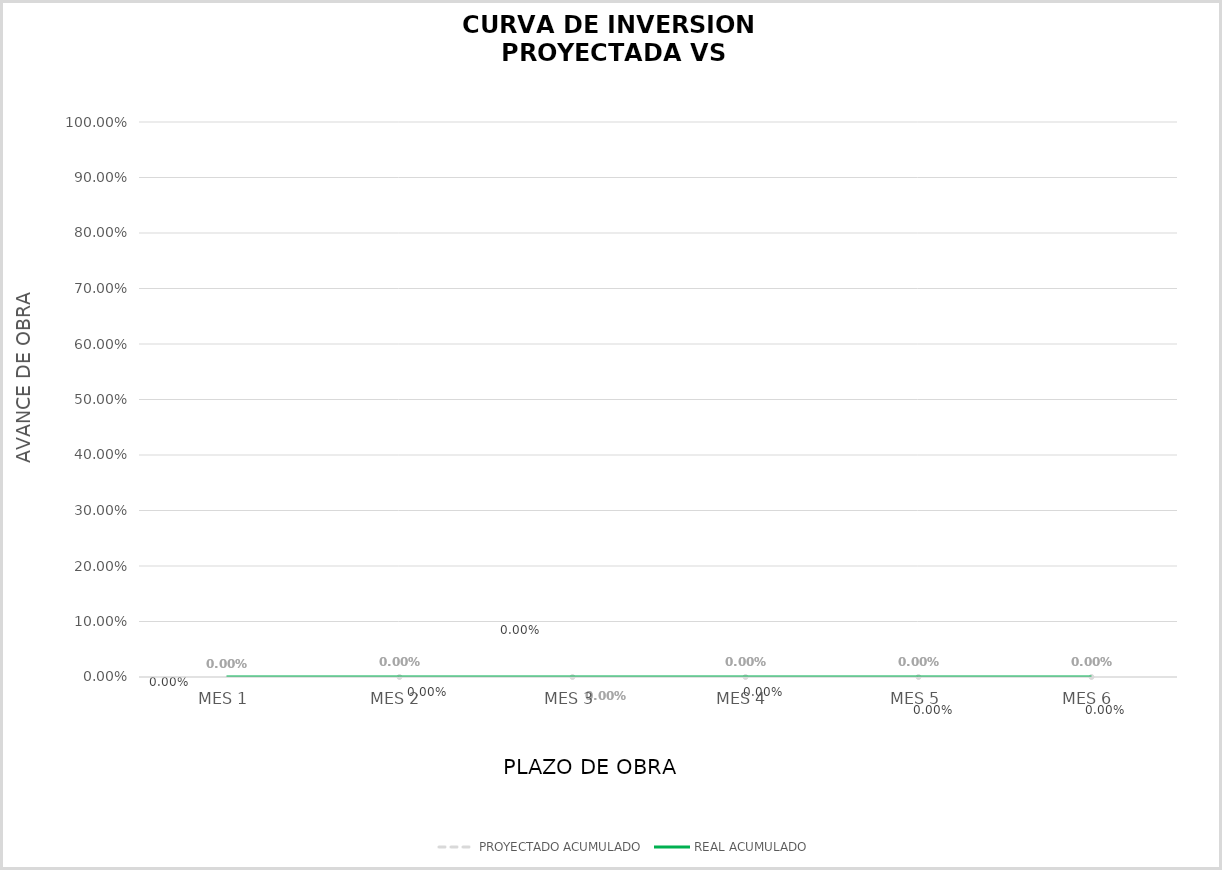
| Category | PROYECTADO ACUMULADO | REAL ACUMULADO |
|---|---|---|
| MES 1 | 0 | 0 |
| MES 2 | 0 | 0 |
| MES 3 | 0 | 0 |
| MES 4 | 0 | 0 |
| MES 5 | 0 | 0 |
| MES 6 | 0 | 0 |